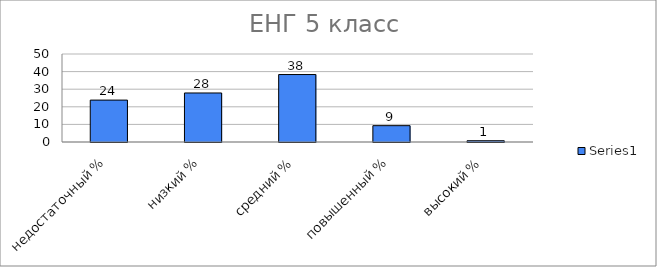
| Category | Series 0 |
|---|---|
| недостаточный % | 23.81 |
| низкий % | 27.857 |
| средний % | 38.333 |
| повышенный % | 9.286 |
| высокий % | 0.714 |